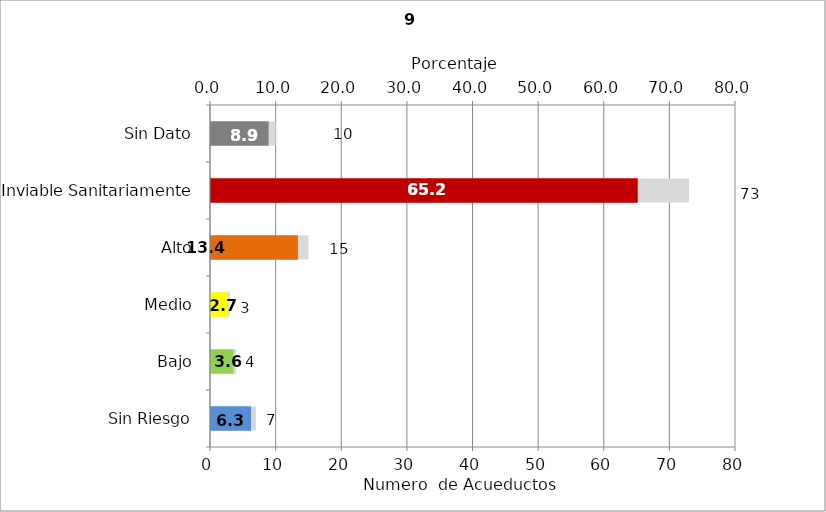
| Category | Número de Sistemas |
|---|---|
| Sin Riesgo | 7 |
| Bajo | 4 |
| Medio | 3 |
| Alto | 15 |
| Inviable Sanitariamente | 73 |
| Sin Dato | 10 |